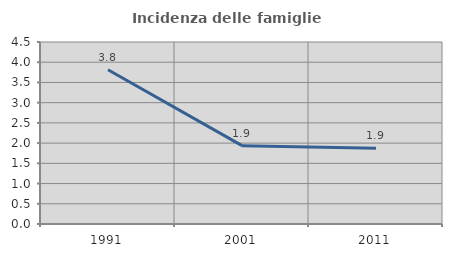
| Category | Incidenza delle famiglie numerose |
|---|---|
| 1991.0 | 3.815 |
| 2001.0 | 1.938 |
| 2011.0 | 1.87 |